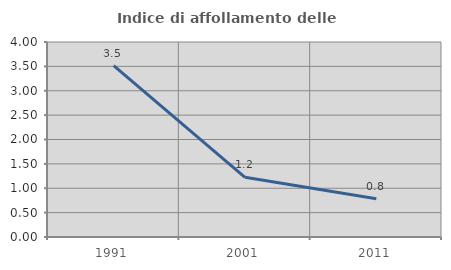
| Category | Indice di affollamento delle abitazioni  |
|---|---|
| 1991.0 | 3.516 |
| 2001.0 | 1.224 |
| 2011.0 | 0.785 |